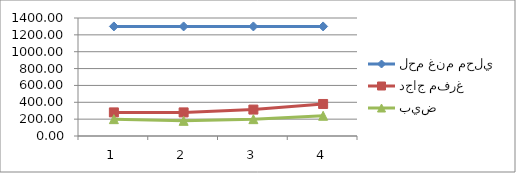
| Category | لحم غنم محلي | دجاج مفرغ | بيض |
|---|---|---|---|
| 0 | 1300 | 280 | 200 |
| 1 | 1300 | 280 | 180 |
| 2 | 1300 | 313.333 | 200 |
| 3 | 1300 | 380 | 240 |